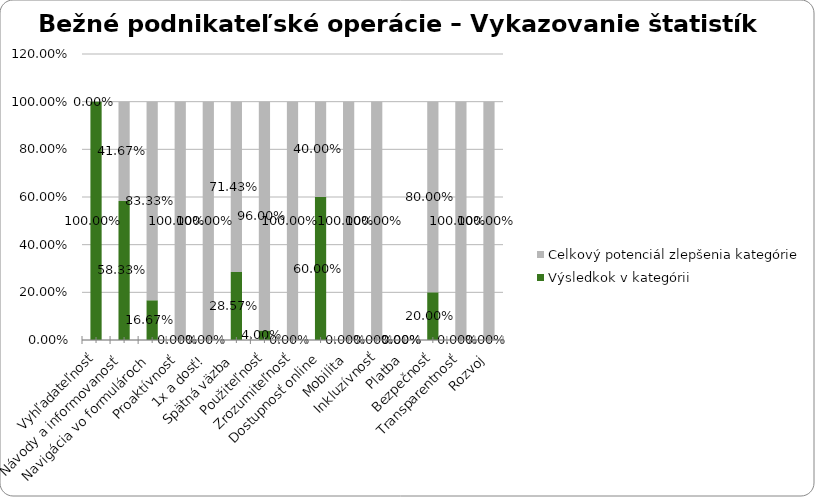
| Category | Výsledkok v kategórii | Celkový potenciál zlepšenia kategórie |
|---|---|---|
| Vyhľadateľnosť | 1 | 0 |
| Návody a informovanosť | 0.583 | 0.417 |
| Navigácia vo formulároch | 0.167 | 0.833 |
| Proaktívnosť | 0 | 1 |
| 1x a dosť! | 0 | 1 |
| Spätná väzba | 0.286 | 0.714 |
| Použiteľnosť | 0.04 | 0.96 |
| Zrozumiteľnosť | 0 | 1 |
| Dostupnosť online | 0.6 | 0.4 |
| Mobilita | 0 | 1 |
| Inkluzívnosť | 0 | 1 |
| Platba | 0 | 0 |
| Bezpečnosť | 0.2 | 0.8 |
| Transparentnosť | 0 | 1 |
| Rozvoj | 0 | 1 |